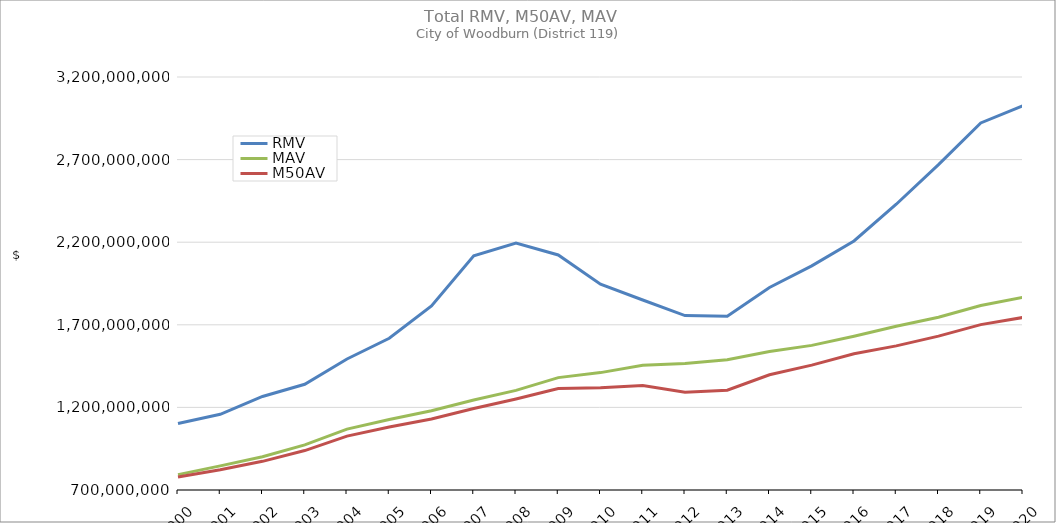
| Category | RMV | MAV | M50AV |
|---|---|---|---|
| 2000.0 | 1103061678 | 792952741 | 778649197 |
| 2001.0 | 1158366430 | 845893842 | 822504438 |
| 2002.0 | 1266347572 | 901437963 | 873511336 |
| 2003.0 | 1340010713 | 973220473 | 938736065 |
| 2004.0 | 1492869516 | 1068368225 | 1026392807 |
| 2005.0 | 1618320515 | 1126244201 | 1081224264 |
| 2006.0 | 1814561895 | 1179266239 | 1129547908 |
| 2007.0 | 2118075839 | 1244795526 | 1193058767 |
| 2008.0 | 2195035263 | 1303179690 | 1251349000 |
| 2009.0 | 2122595968 | 1380244637 | 1314569666 |
| 2010.0 | 1945383324 | 1410570536 | 1319427144 |
| 2011.0 | 1850222994 | 1454543161 | 1333029873 |
| 2012.0 | 1756070733 | 1465681802 | 1291878687 |
| 2013.0 | 1751863767 | 1488130723 | 1304184511 |
| 2014.0 | 1925612145 | 1538704515 | 1397629743 |
| 2015.0 | 2056463271 | 1575452203 | 1455738769 |
| 2016.0 | 2207659188 | 1631134248 | 1524882342 |
| 2017.0 | 2429890960 | 1691493102 | 1572282375 |
| 2018.0 | 2669251668 | 1745691886 | 1631394823 |
| 2019.0 | 2921850774 | 1816952034 | 1701142608 |
| 2020.0 | 3026488916 | 1866488604 | 1744345703 |